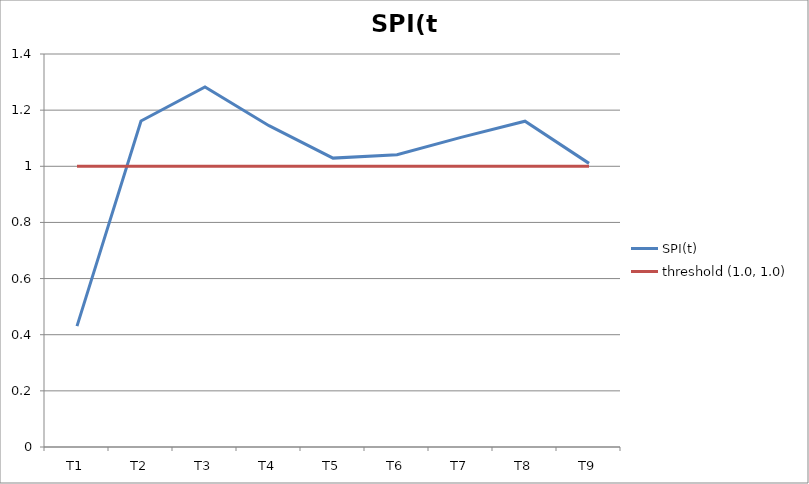
| Category | SPI(t) | threshold (1.0, 1.0) |
|---|---|---|
| T1 | 0.431 | 1 |
| T2 | 1.161 | 1 |
| T3 | 1.282 | 1 |
| T4 | 1.145 | 1 |
| T5 | 1.029 | 1 |
| T6 | 1.041 | 1 |
| T7 | 1.103 | 1 |
| T8 | 1.161 | 1 |
| T9 | 1.01 | 1 |